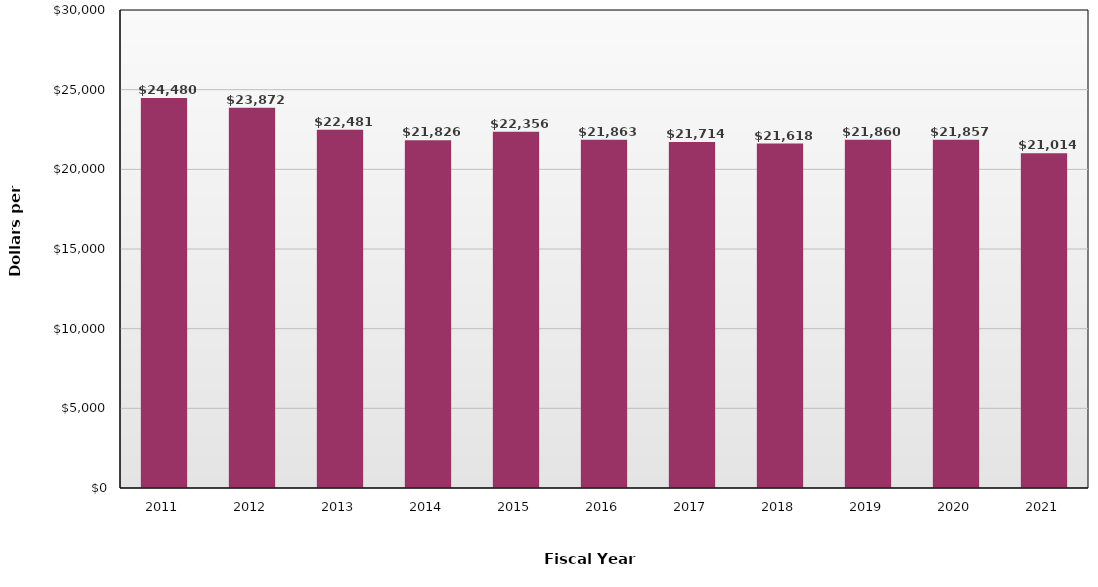
| Category | Dollars per FTE |
|---|---|
| 2011.0 | 24480 |
| 2012.0 | 23872 |
| 2013.0 | 22481 |
| 2014.0 | 21826 |
| 2015.0 | 22356 |
| 2016.0 | 21863 |
| 2017.0 | 21714 |
| 2018.0 | 21618 |
| 2019.0 | 21860 |
| 2020.0 | 21857 |
| 2021.0 | 21014 |